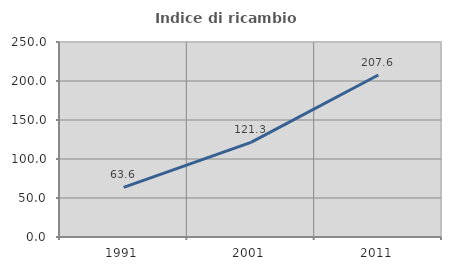
| Category | Indice di ricambio occupazionale  |
|---|---|
| 1991.0 | 63.559 |
| 2001.0 | 121.311 |
| 2011.0 | 207.639 |